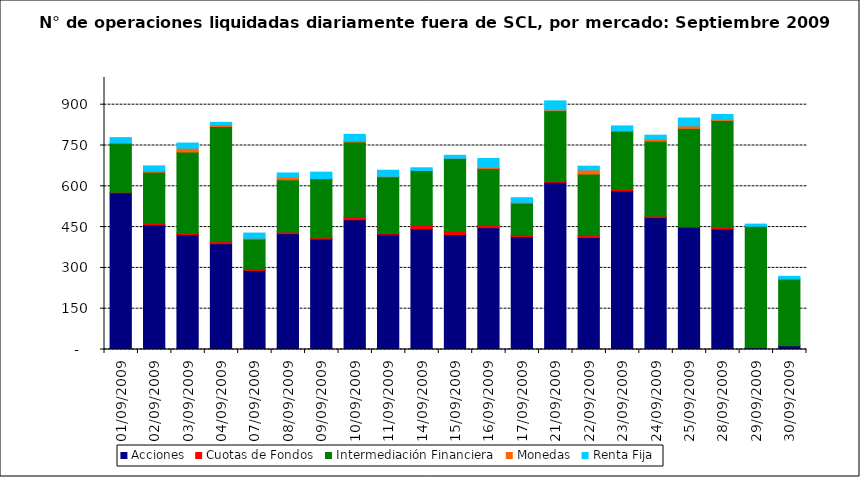
| Category | Acciones | Cuotas de Fondos | Intermediación Financiera | Monedas | Renta Fija |
|---|---|---|---|---|---|
| 01/09/2009 | 576 | 2 | 181 | 0 | 20 |
| 02/09/2009 | 459 | 4 | 189 | 6 | 17 |
| 03/09/2009 | 423 | 6 | 297 | 14 | 19 |
| 04/09/2009 | 389 | 7 | 424 | 6 | 9 |
| 07/09/2009 | 291 | 4 | 111 | 3 | 19 |
| 08/09/2009 | 426 | 6 | 192 | 9 | 16 |
| 09/09/2009 | 406 | 5 | 217 | 0 | 24 |
| 10/09/2009 | 477 | 10 | 276 | 5 | 23 |
| 11/09/2009 | 424 | 6 | 205 | 2 | 22 |
| 14/09/2009 | 444 | 16 | 198 | 0 | 10 |
| 15/09/2009 | 423 | 11 | 268 | 1 | 11 |
| 16/09/2009 | 448 | 8 | 209 | 4 | 33 |
| 17/09/2009 | 415 | 4 | 119 | 3 | 17 |
| 21/09/2009 | 615 | 5 | 258 | 3 | 33 |
| 22/09/2009 | 412 | 7 | 226 | 15 | 14 |
| 23/09/2009 | 583 | 9 | 211 | 1 | 18 |
| 24/09/2009 | 485 | 6 | 275 | 7 | 15 |
| 25/09/2009 | 450 | 1 | 362 | 9 | 29 |
| 28/09/2009 | 443 | 7 | 392 | 3 | 19 |
| 29/09/2009 | 6 | 0 | 447 | 0 | 8 |
| 30/09/2009 | 14 | 0 | 245 | 0 | 10 |